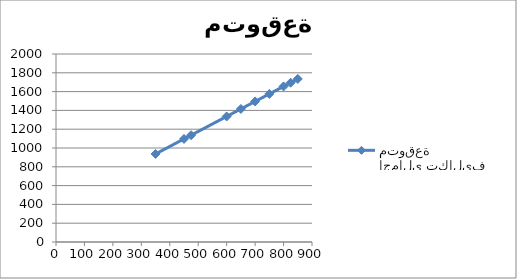
| Category | اجمالي تكاليف متوقعة |
|---|---|
| 700.0 | 1495.275 |
| 600.0 | 1335.684 |
| 450.0 | 1096.299 |
| 350.0 | 936.709 |
| 475.0 | 1136.196 |
| 650.0 | 1415.48 |
| 750.0 | 1575.07 |
| 825.0 | 1694.763 |
| 850.0 | 1734.66 |
| 800.0 | 1654.865 |